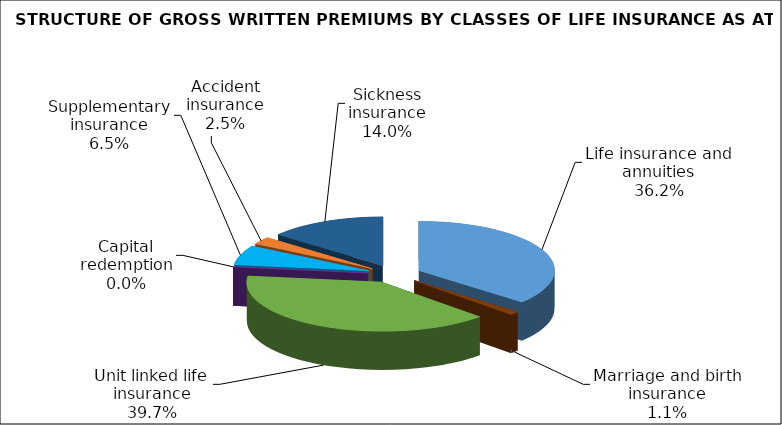
| Category | Series 0 |
|---|---|
| Life insurance and annuities | 127548680.327 |
| Marriage and birth insurance | 3861447.926 |
| Unit linked life insurance | 139722094.119 |
| Capital redemption | 0 |
| Supplementary insurance | 22831160.154 |
| Accident insurance | 8660855.65 |
| Sickness insurance | 49467757.94 |